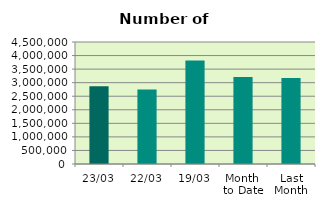
| Category | Series 0 |
|---|---|
| 23/03 | 2870366 |
| 22/03 | 2752122 |
| 19/03 | 3821100 |
| Month 
to Date | 3207556.941 |
| Last
Month | 3172414.4 |